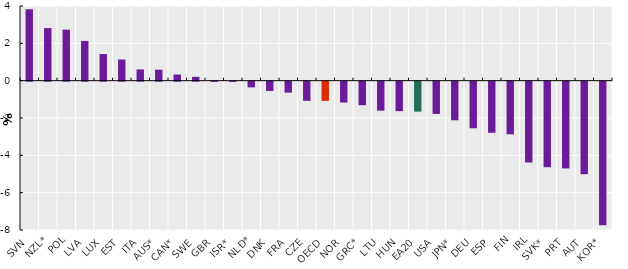
| Category | Percentage change Q4 2019 - Q1 2023 |
|---|---|
| SVN | 3.826 |
| NZL* | 2.817 |
| POL | 2.734 |
| LVA | 2.127 |
| LUX | 1.427 |
| EST | 1.132 |
| ITA | 0.604 |
| AUS* | 0.588 |
| CAN* | 0.329 |
| SWE | 0.205 |
| GBR | -0.012 |
| ISR* | -0.013 |
| NLD* | -0.306 |
| DNK | -0.498 |
| FRA | -0.587 |
| CZE | -1.027 |
| OECD | -1.027 |
| NOR | -1.116 |
| GRC* | -1.263 |
| LTU | -1.553 |
| HUN | -1.58 |
| EA20 | -1.604 |
| USA | -1.727 |
| JPN* | -2.068 |
| DEU | -2.495 |
| ESP | -2.741 |
| FIN | -2.819 |
| IRL | -4.33 |
| SVK* | -4.582 |
| PRT | -4.648 |
| AUT | -4.956 |
| KOR* | -7.695 |